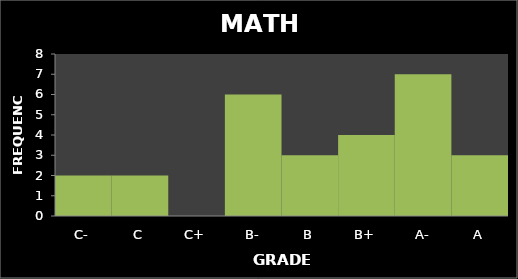
| Category | Series 0 |
|---|---|
| C- | 2 |
| C | 2 |
| C+ | 0 |
| B- | 6 |
| B | 3 |
| B+ | 4 |
| A- | 7 |
| A | 3 |